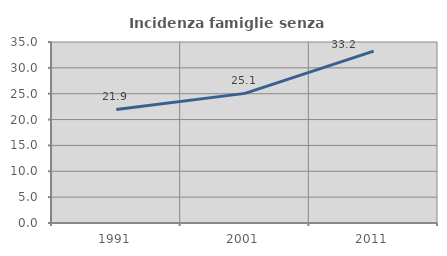
| Category | Incidenza famiglie senza nuclei |
|---|---|
| 1991.0 | 21.949 |
| 2001.0 | 25.064 |
| 2011.0 | 33.221 |